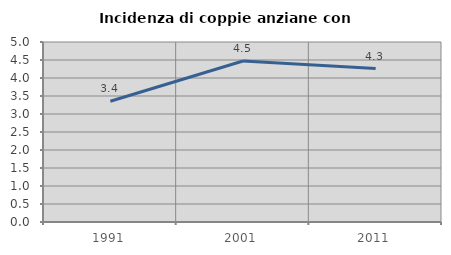
| Category | Incidenza di coppie anziane con figli |
|---|---|
| 1991.0 | 3.356 |
| 2001.0 | 4.471 |
| 2011.0 | 4.261 |